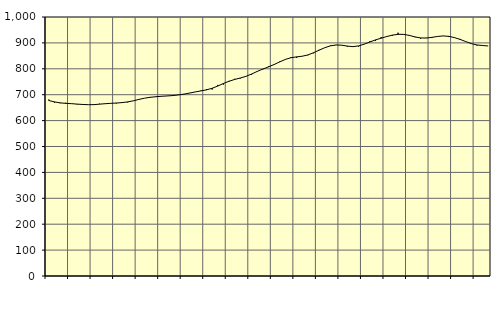
| Category | Piggar | Series 1 |
|---|---|---|
| nan | 681.4 | 677.5 |
| 1.0 | 669.4 | 672.19 |
| 1.0 | 667.3 | 668.44 |
| 1.0 | 668.9 | 666.61 |
| nan | 665 | 665.43 |
| 2.0 | 662.6 | 663.72 |
| 2.0 | 664 | 662.31 |
| 2.0 | 661.3 | 661.38 |
| nan | 660.5 | 661.67 |
| 3.0 | 665.2 | 663.46 |
| 3.0 | 665.6 | 665.22 |
| 3.0 | 666.4 | 666.65 |
| nan | 666.1 | 667.89 |
| 4.0 | 670.3 | 669.51 |
| 4.0 | 670.3 | 672.23 |
| 4.0 | 676.6 | 676.34 |
| nan | 682.3 | 681.81 |
| 5.0 | 686.6 | 686.63 |
| 5.0 | 691.2 | 689.92 |
| 5.0 | 691.1 | 692.16 |
| nan | 694.8 | 693.86 |
| 6.0 | 695.3 | 695.15 |
| 6.0 | 694.9 | 696.68 |
| 6.0 | 699.8 | 699.03 |
| nan | 701.2 | 702.3 |
| 7.0 | 706.9 | 706.27 |
| 7.0 | 710.8 | 710.67 |
| 7.0 | 715.9 | 714.65 |
| nan | 721.5 | 718.8 |
| 8.0 | 719.8 | 724.88 |
| 8.0 | 737.7 | 733.46 |
| 8.0 | 739.1 | 743.34 |
| nan | 753.2 | 751.91 |
| 9.0 | 761.4 | 758.96 |
| 9.0 | 762.8 | 764.5 |
| 9.0 | 771.2 | 770.85 |
| nan | 777.4 | 779.86 |
| 10.0 | 791 | 789.93 |
| 10.0 | 798.3 | 799.03 |
| 10.0 | 809.9 | 807.45 |
| nan | 814.9 | 816.57 |
| 11.0 | 828.6 | 826.72 |
| 11.0 | 835.6 | 836.32 |
| 11.0 | 844.8 | 842.81 |
| nan | 842.1 | 846.08 |
| 12.0 | 848.1 | 848.64 |
| 12.0 | 852.4 | 853.58 |
| 12.0 | 859.8 | 862.12 |
| nan | 873.3 | 872.1 |
| 13.0 | 881.5 | 881.57 |
| 13.0 | 890.4 | 888.65 |
| 13.0 | 892.4 | 891.92 |
| nan | 891.6 | 891.11 |
| 14.0 | 885.4 | 887.68 |
| 14.0 | 885.7 | 885.59 |
| 14.0 | 886 | 888.34 |
| nan | 895.7 | 895.21 |
| 15.0 | 907 | 903.62 |
| 15.0 | 907.2 | 911.62 |
| 15.0 | 922.7 | 918.16 |
| nan | 926.2 | 924.61 |
| 16.0 | 927.4 | 929.97 |
| 16.0 | 939.2 | 933.08 |
| 16.0 | 931.5 | 932.9 |
| nan | 930.6 | 928.82 |
| 17.0 | 922.1 | 923.17 |
| 17.0 | 916.6 | 919.22 |
| 17.0 | 919.6 | 918.72 |
| nan | 918.7 | 921.45 |
| 18.0 | 924.3 | 924.87 |
| 18.0 | 927.1 | 926.86 |
| 18.0 | 922.6 | 925.36 |
| nan | 919.9 | 920.5 |
| 19.0 | 915.4 | 913.63 |
| 19.0 | 906 | 905.26 |
| 19.0 | 897.4 | 897.24 |
| nan | 889.9 | 891.98 |
| 20.0 | 891.4 | 889.94 |
| 20.0 | 888.1 | 888.2 |